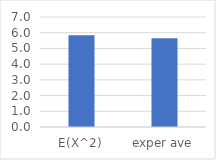
| Category | Series 0 |
|---|---|
| E(X^2) | 5.833 |
| exper ave | 5.646 |